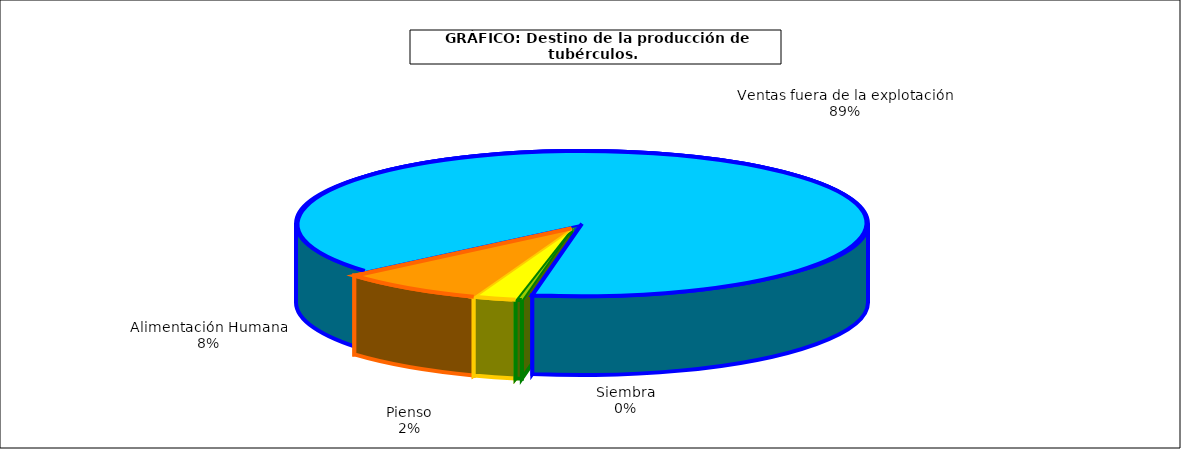
| Category | Series 0 |
|---|---|
| 0 | 7640 |
| 1 | 52421 |
| 2 | 176842 |
| 3 | 1927558 |